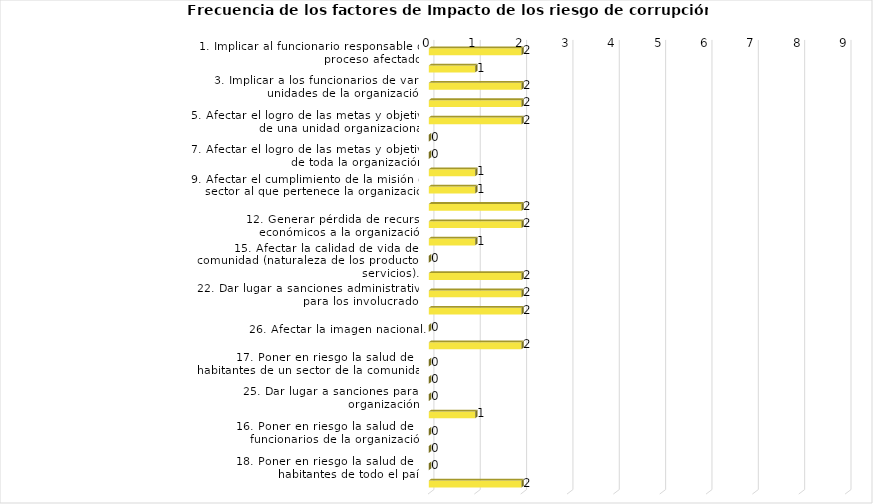
| Category | Series 0 |
|---|---|
| 1. Implicar al funcionario responsable del proceso afectado. | 2 |
| 2. Implicar a los funcionarios de una unidad organizacional. | 1 |
| 3. Implicar a los funcionarios de varias unidades de la organización. | 2 |
| 4. Afectar el logro de las metas y objetivos del proceso. | 2 |
| 5. Afectar el logro de las metas y objetivos de una unidad organizacional. | 2 |
| 6. Afectar el logro de las metas y objetivos de varias unidades de la organización. | 0 |
| 7. Afectar el logro de las metas y objetivos de toda la organización. | 0 |
| 8. Afectar el cumplimiento de la misión de la organización. | 1 |
| 9. Afectar el cumplimiento de la misión del sector al que pertenece la organización. | 1 |
| 10. Generar pérdida de confianza en la organización. | 2 |
| 12. Generar pérdida de recursos económicos a la organización. | 2 |
| 13. Generar pérdida de información para la organización. | 1 |
| 15. Afectar la calidad de vida de la comunidad (naturaleza de los productos / servicios).  | 0 |
| 21. Generar intervención de los órganos de control (Fiscalía, u otro ente). | 2 |
| 22. Dar lugar a sanciones administrativas para los involucrados. | 2 |
| 23. Dar lugar a sanciones penales para los involucrados. | 2 |
| 26. Afectar la imagen nacional. | 0 |
| 11. Generar pérdida de confianza en el sector al que pertenece la organización. | 2 |
| 17. Poner en riesgo la salud de los habitantes de un sector de la comunidad. | 0 |
| 20. Poner en riesgo de muerte a los habitantes de la comunidad. | 0 |
| 25. Dar lugar a sanciones para la organización. | 0 |
| 14. Afectar la calidad / costo de los productos / servicios que presta la organización. | 1 |
| 16. Poner en riesgo la salud de los funcionarios de la organización. | 0 |
| 19. Poner en riesgo de muerte a los funcionarios de la organización. | 0 |
| 18. Poner en riesgo la salud de los habitantes de todo el país. | 0 |
| 24. Dar lugar a sanciones fiscales (tributarias) para los involucrados. | 2 |